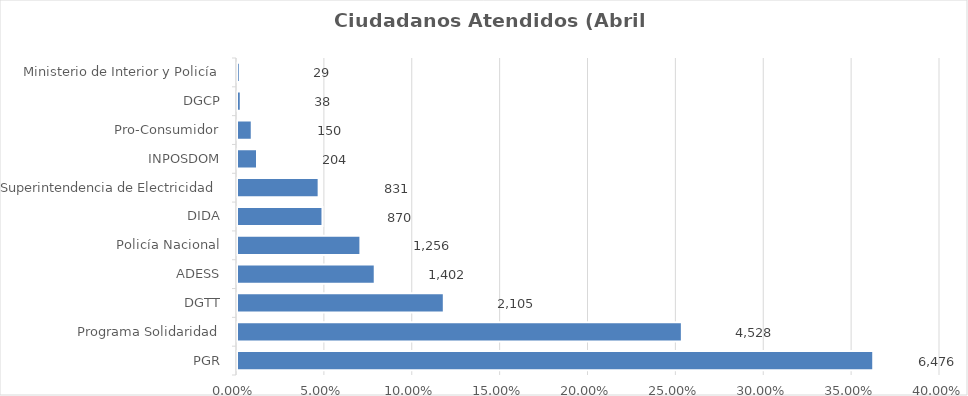
| Category | Porcentaje |
|---|---|
| PGR | 0.362 |
| Programa Solidaridad | 0.253 |
| DGTT | 0.118 |
| ADESS | 0.078 |
| Policía Nacional | 0.07 |
| DIDA | 0.049 |
| Superintendencia de Electricidad | 0.046 |
| INPOSDOM | 0.011 |
| Pro-Consumidor | 0.008 |
| DGCP | 0.002 |
| Ministerio de Interior y Policía | 0.002 |